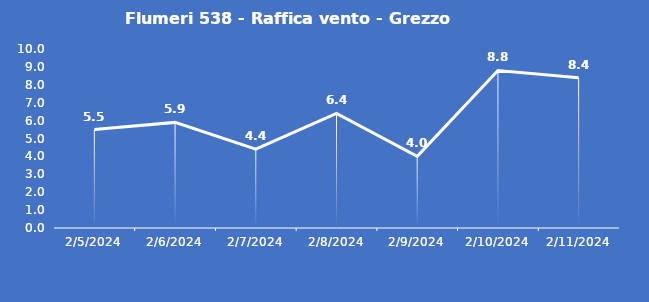
| Category | Flumeri 538 - Raffica vento - Grezzo (m/s) |
|---|---|
| 2/5/24 | 5.5 |
| 2/6/24 | 5.9 |
| 2/7/24 | 4.4 |
| 2/8/24 | 6.4 |
| 2/9/24 | 4 |
| 2/10/24 | 8.8 |
| 2/11/24 | 8.4 |